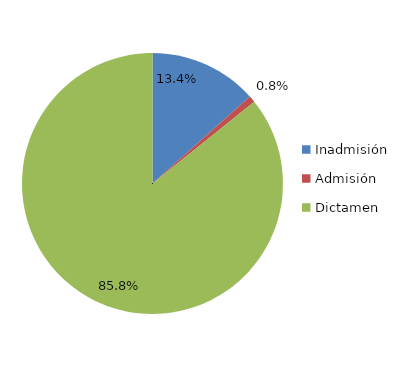
| Category | Series 0 |
|---|---|
| Inadmisión  | 241 |
| Admisión | 15 |
| Dictamen | 1542 |